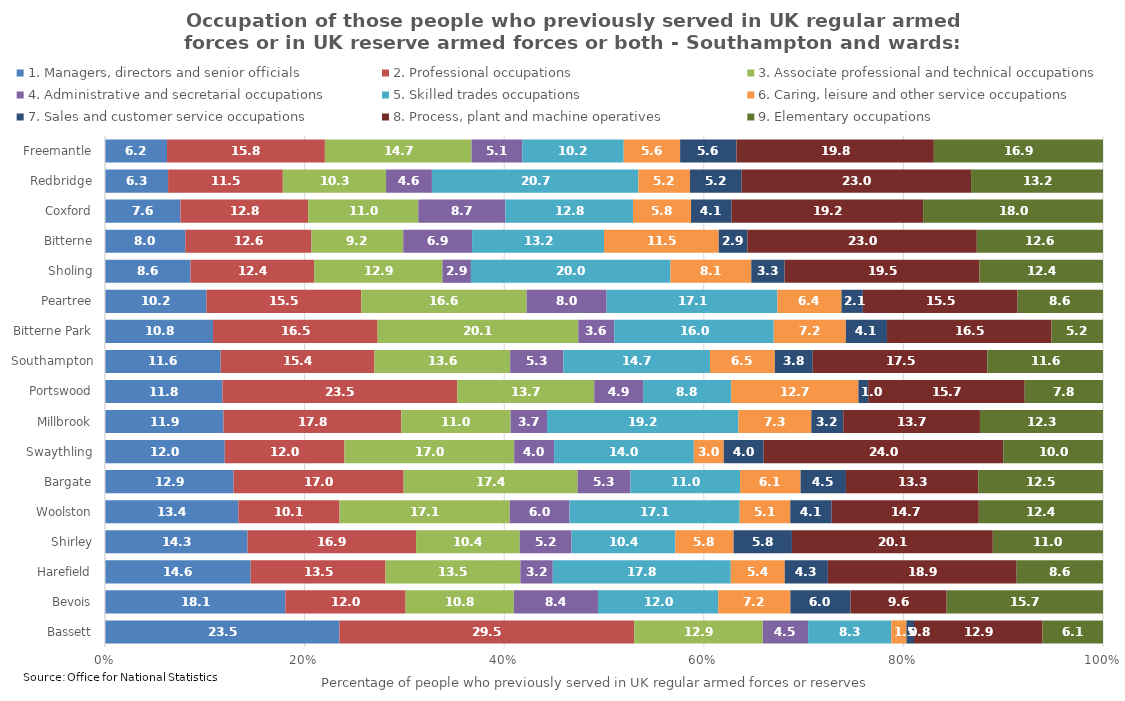
| Category | 1. Managers, directors and senior officials | 2. Professional occupations | 3. Associate professional and technical occupations | 4. Administrative and secretarial occupations | 5. Skilled trades occupations | 6. Caring, leisure and other service occupations | 7. Sales and customer service occupations | 8. Process, plant and machine operatives | 9. Elementary occupations |
|---|---|---|---|---|---|---|---|---|---|
| Bassett | 23.485 | 29.545 | 12.879 | 4.545 | 8.333 | 1.515 | 0.758 | 12.879 | 6.061 |
| Bevois | 18.072 | 12.048 | 10.843 | 8.434 | 12.048 | 7.229 | 6.024 | 9.639 | 15.663 |
| Harefield | 14.595 | 13.514 | 13.514 | 3.243 | 17.838 | 5.405 | 4.324 | 18.919 | 8.649 |
| Shirley | 14.286 | 16.883 | 10.39 | 5.195 | 10.39 | 5.844 | 5.844 | 20.13 | 11.039 |
| Woolston | 13.364 | 10.138 | 17.051 | 5.991 | 17.051 | 5.069 | 4.147 | 14.747 | 12.442 |
| Bargate | 12.879 | 17.045 | 17.424 | 5.303 | 10.985 | 6.061 | 4.545 | 13.258 | 12.5 |
| Swaythling | 12 | 12 | 17 | 4 | 14 | 3 | 4 | 24 | 10 |
| Millbrook | 11.872 | 17.808 | 10.959 | 3.653 | 19.178 | 7.306 | 3.196 | 13.699 | 12.329 |
| Portswood | 11.765 | 23.529 | 13.725 | 4.902 | 8.824 | 12.745 | 0.98 | 15.686 | 7.843 |
| Southampton | 11.6 | 15.421 | 13.6 | 5.335 | 14.7 | 6.503 | 3.8 | 17.5 | 11.6 |
| Bitterne Park | 10.825 | 16.495 | 20.103 | 3.608 | 15.979 | 7.216 | 4.124 | 16.495 | 5.155 |
| Peartree | 10.16 | 15.508 | 16.578 | 8.021 | 17.112 | 6.417 | 2.139 | 15.508 | 8.556 |
| Sholing | 8.571 | 12.381 | 12.857 | 2.857 | 20 | 8.095 | 3.333 | 19.524 | 12.381 |
| Bitterne | 8.046 | 12.644 | 9.195 | 6.897 | 13.218 | 11.494 | 2.874 | 22.989 | 12.644 |
| Coxford | 7.558 | 12.791 | 11.047 | 8.721 | 12.791 | 5.814 | 4.07 | 19.186 | 18.023 |
| Redbridge | 6.322 | 11.494 | 10.345 | 4.598 | 20.69 | 5.172 | 5.172 | 22.989 | 13.218 |
| Freemantle | 6.215 | 15.819 | 14.689 | 5.085 | 10.169 | 5.65 | 5.65 | 19.774 | 16.949 |